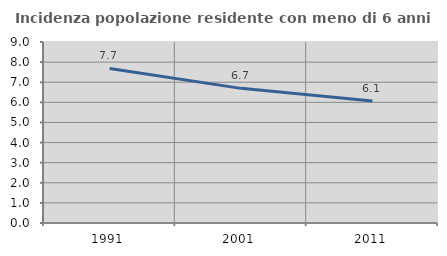
| Category | Incidenza popolazione residente con meno di 6 anni |
|---|---|
| 1991.0 | 7.688 |
| 2001.0 | 6.695 |
| 2011.0 | 6.061 |